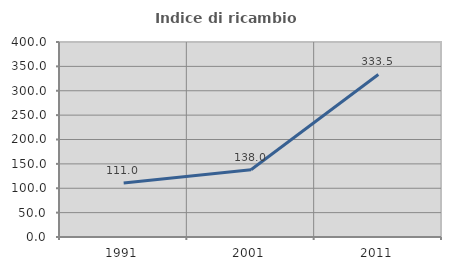
| Category | Indice di ricambio occupazionale  |
|---|---|
| 1991.0 | 110.968 |
| 2001.0 | 138.005 |
| 2011.0 | 333.469 |